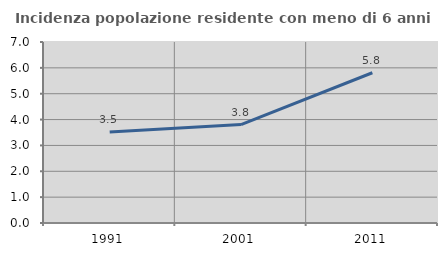
| Category | Incidenza popolazione residente con meno di 6 anni |
|---|---|
| 1991.0 | 3.519 |
| 2001.0 | 3.808 |
| 2011.0 | 5.81 |